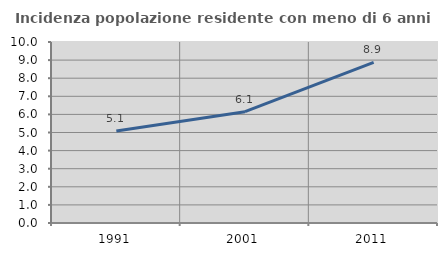
| Category | Incidenza popolazione residente con meno di 6 anni |
|---|---|
| 1991.0 | 5.083 |
| 2001.0 | 6.148 |
| 2011.0 | 8.876 |